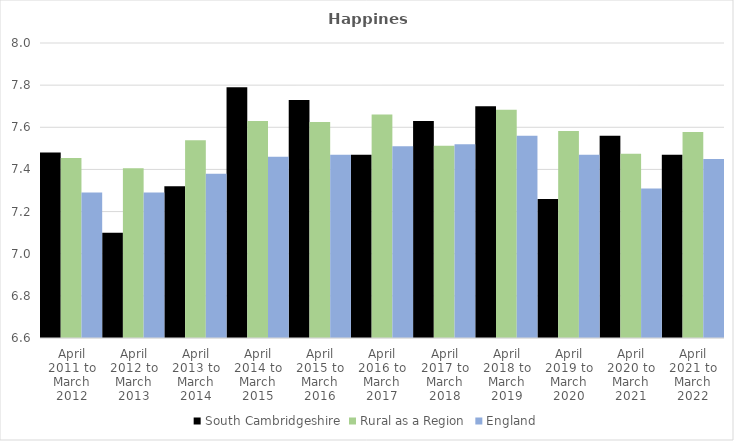
| Category | South Cambridgeshire | Rural as a Region | England |
|---|---|---|---|
| April 2011 to March 2012 | 7.48 | 7.454 | 7.29 |
| April 2012 to March 2013 | 7.1 | 7.406 | 7.29 |
| April 2013 to March 2014 | 7.32 | 7.539 | 7.38 |
| April 2014 to March 2015 | 7.79 | 7.63 | 7.46 |
| April 2015 to March 2016 | 7.73 | 7.625 | 7.47 |
| April 2016 to March 2017 | 7.47 | 7.661 | 7.51 |
| April 2017 to March 2018 | 7.63 | 7.513 | 7.52 |
| April 2018 to March 2019 | 7.7 | 7.684 | 7.56 |
| April 2019 to March 2020 | 7.26 | 7.582 | 7.47 |
| April 2020 to March 2021 | 7.56 | 7.474 | 7.31 |
| April 2021 to March 2022 | 7.47 | 7.577 | 7.45 |